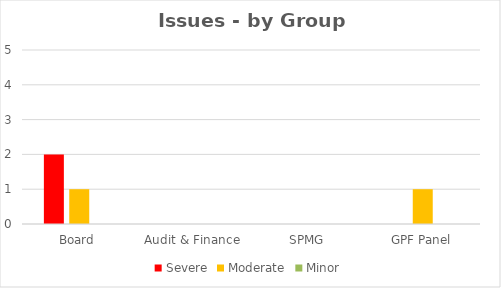
| Category | Severe | Moderate | Minor |
|---|---|---|---|
| Board | 2 | 1 | 0 |
| Audit & Finance | 0 | 0 | 0 |
| SPMG | 0 | 0 | 0 |
| GPF Panel | 0 | 1 | 0 |